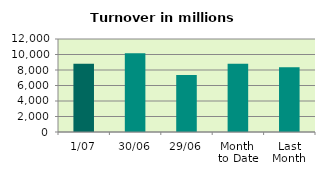
| Category | Series 0 |
|---|---|
| 1/07 | 8822.078 |
| 30/06 | 10167.398 |
| 29/06 | 7361.429 |
| Month 
to Date | 8822.078 |
| Last
Month | 8344.334 |